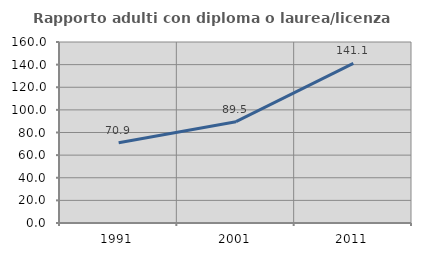
| Category | Rapporto adulti con diploma o laurea/licenza media  |
|---|---|
| 1991.0 | 70.892 |
| 2001.0 | 89.532 |
| 2011.0 | 141.121 |